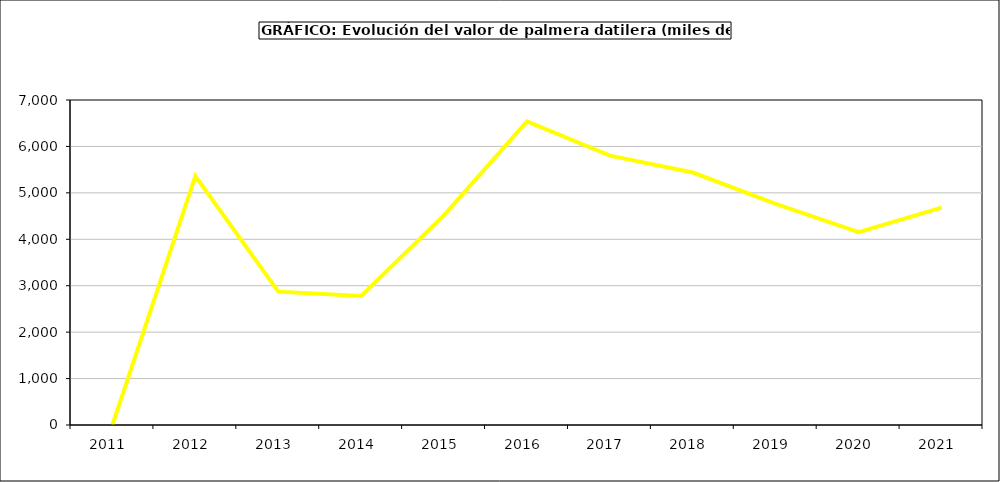
| Category | valor kiwi |
|---|---|
| 2011.0 | 0 |
| 2012.0 | 5362.2 |
| 2013.0 | 2872 |
| 2014.0 | 2781 |
| 2015.0 | 4520 |
| 2016.0 | 6537 |
| 2017.0 | 5802.72 |
| 2018.0 | 5438.16 |
| 2019.0 | 4764.375 |
| 2020.0 | 4155.938 |
| 2021.0 | 4682.19 |